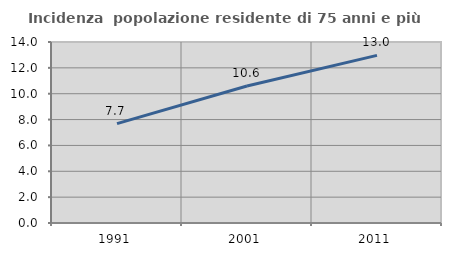
| Category | Incidenza  popolazione residente di 75 anni e più |
|---|---|
| 1991.0 | 7.688 |
| 2001.0 | 10.593 |
| 2011.0 | 12.968 |